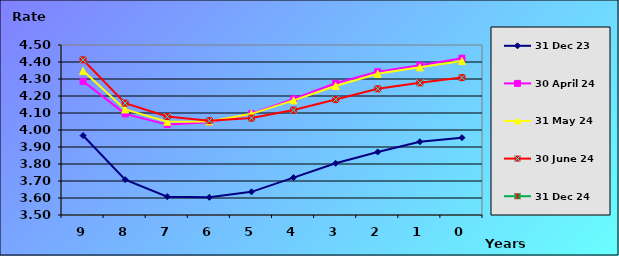
| Category | 31 Dec 23 | 30 April 24 | 31 May 24 | 30 June 24 | 31 Dec 24 |
|---|---|---|---|---|---|
| 9.0 | 3.967 | 4.286 | 4.348 | 4.413 |  |
| 8.0 | 3.708 | 4.095 | 4.121 | 4.157 |  |
| 7.0 | 3.608 | 4.032 | 4.049 | 4.079 |  |
| 6.0 | 3.604 | 4.046 | 4.05 | 4.055 |  |
| 5.0 | 3.636 | 4.096 | 4.095 | 4.07 |  |
| 4.0 | 3.72 | 4.183 | 4.174 | 4.117 |  |
| 3.0 | 3.804 | 4.275 | 4.259 | 4.179 |  |
| 2.0 | 3.871 | 4.343 | 4.33 | 4.242 |  |
| 1.0 | 3.931 | 4.381 | 4.369 | 4.277 |  |
| 0.0 | 3.955 | 4.422 | 4.406 | 4.309 |  |